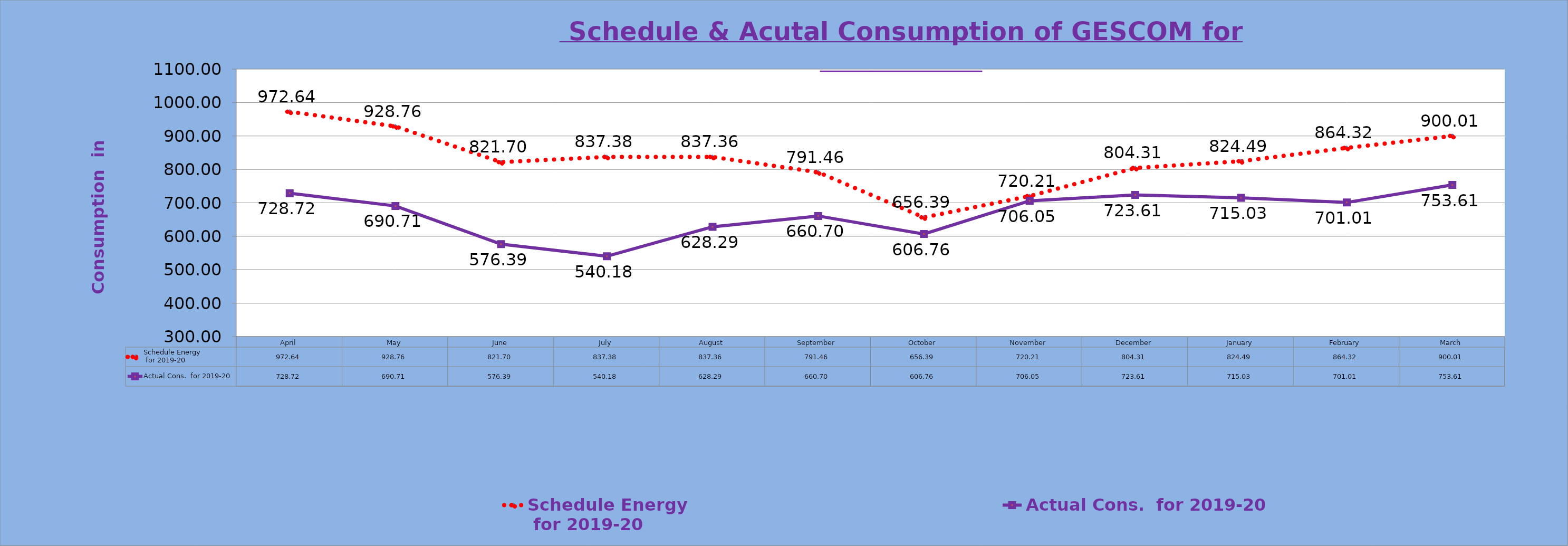
| Category | Schedule Energy           
 for 2019-20 | Actual Cons.  for 2019-20 |
|---|---|---|
| April | 972.64 | 728.723 |
| May | 928.76 | 690.711 |
| June | 821.7 | 576.388 |
| July | 837.38 | 540.175 |
| August | 837.36 | 628.285 |
| September | 791.46 | 660.703 |
| October | 656.394 | 606.757 |
| November | 720.207 | 706.045 |
| December | 804.314 | 723.61 |
| January | 824.493 | 715.034 |
| February | 864.321 | 701.01 |
| March | 900.011 | 753.609 |